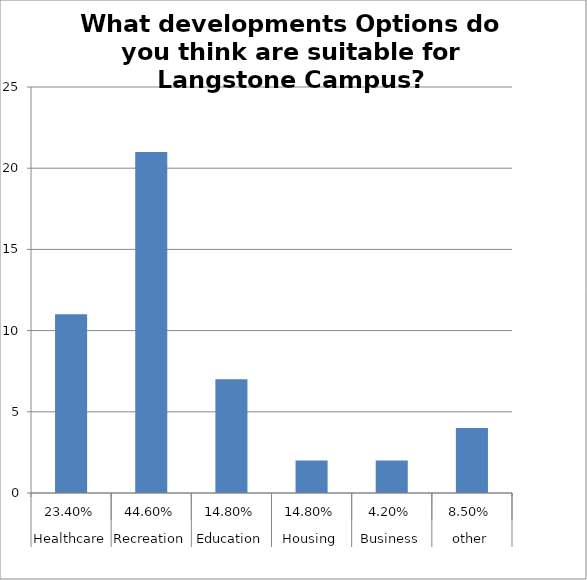
| Category | option |
|---|---|
| 0 | 11 |
| 1 | 21 |
| 2 | 7 |
| 3 | 2 |
| 4 | 2 |
| 5 | 4 |